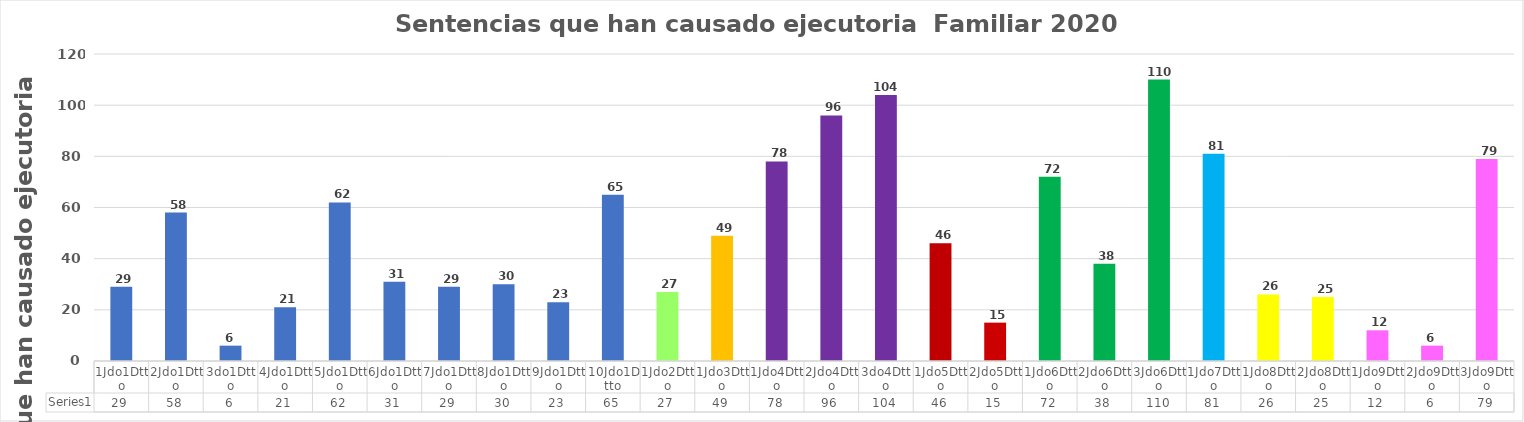
| Category | Series 0 |
|---|---|
| 1Jdo1Dtto | 29 |
| 2Jdo1Dtto | 58 |
| 3do1Dtto | 6 |
| 4Jdo1Dtto | 21 |
| 5Jdo1Dtto | 62 |
| 6Jdo1Dtto | 31 |
| 7Jdo1Dtto | 29 |
| 8Jdo1Dtto | 30 |
| 9Jdo1Dtto | 23 |
| 10Jdo1Dtto | 65 |
| 1Jdo2Dtto | 27 |
| 1Jdo3Dtto | 49 |
| 1Jdo4Dtto | 78 |
| 2Jdo4Dtto | 96 |
| 3do4Dtto | 104 |
| 1Jdo5Dtto | 46 |
| 2Jdo5Dtto | 15 |
| 1Jdo6Dtto | 72 |
| 2Jdo6Dtto | 38 |
| 3Jdo6Dtto | 110 |
| 1Jdo7Dtto | 81 |
| 1Jdo8Dtto | 26 |
| 2Jdo8Dtto | 25 |
| 1Jdo9Dtto | 12 |
| 2Jdo9Dtto | 6 |
| 3Jdo9Dtto | 79 |